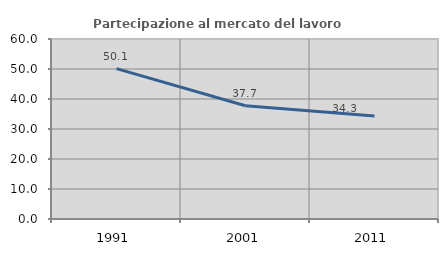
| Category | Partecipazione al mercato del lavoro  femminile |
|---|---|
| 1991.0 | 50.108 |
| 2001.0 | 37.74 |
| 2011.0 | 34.342 |